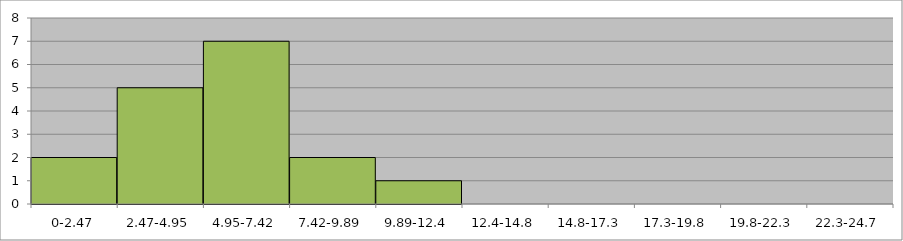
| Category | Series 0 |
|---|---|
| 0-2.47 | 2 |
| 2.47-4.95 | 5 |
| 4.95-7.42 | 7 |
| 7.42-9.89 | 2 |
| 9.89-12.4 | 1 |
| 12.4-14.8 | 0 |
| 14.8-17.3 | 0 |
| 17.3-19.8 | 0 |
| 19.8-22.3 | 0 |
| 22.3-24.7 | 0 |